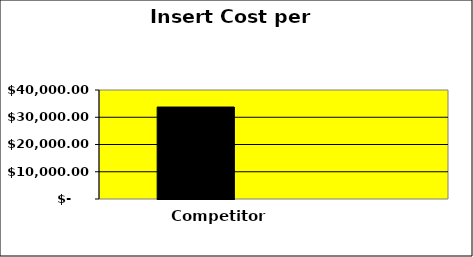
| Category | Competitor | Toshiba | Series 2 |
|---|---|---|---|
| 0 | 33750 |  | 0 |